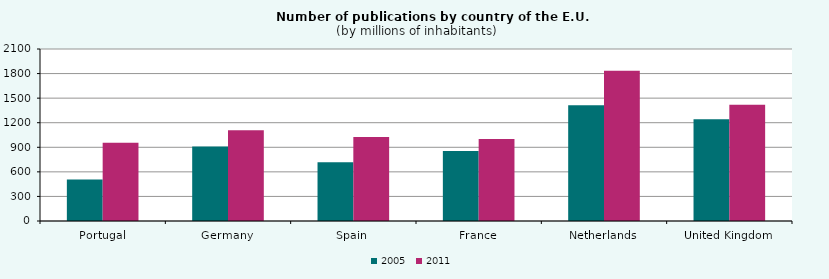
| Category | 2005 | 2011 |
|---|---|---|
| Portugal | 507.253 | 954.015 |
| Germany | 908.209 | 1106.608 |
| Spain | 717.505 | 1026.652 |
| France | 854.493 | 999.686 |
| Netherlands | 1413.447 | 1834.796 |
| United Kingdom | 1241.96 | 1418.768 |